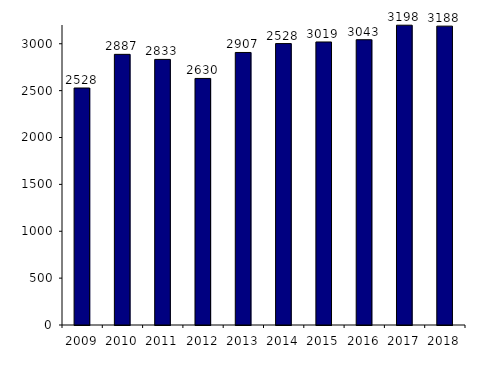
| Category | Nombre de patients autogreffés |
|---|---|
| 2009.0 | 2528 |
| 2010.0 | 2887 |
| 2011.0 | 2833 |
| 2012.0 | 2630 |
| 2013.0 | 2907 |
| 2014.0 | 3002 |
| 2015.0 | 3019 |
| 2016.0 | 3043 |
| 2017.0 | 3198 |
| 2018.0 | 3188 |